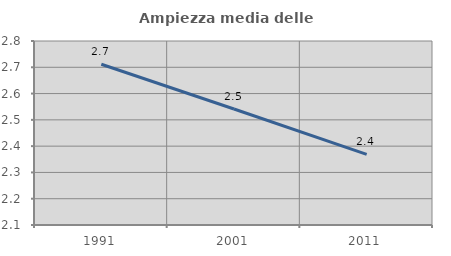
| Category | Ampiezza media delle famiglie |
|---|---|
| 1991.0 | 2.711 |
| 2001.0 | 2.541 |
| 2011.0 | 2.368 |